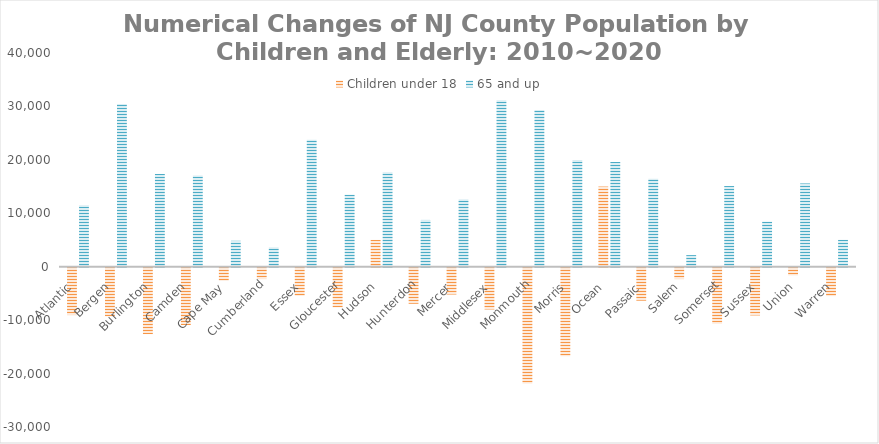
| Category | Children under 18 | 65 and up |
|---|---|---|
| Atlantic  | -8867 | 11502 |
| Bergen  | -9106 | 30448 |
| Burlington  | -12435 | 17340 |
| Camden  | -10718 | 17081 |
| Cape May  | -2441 | 4854 |
| Cumberland | -2123 | 3624 |
| Essex  | -5261 | 23770 |
| Gloucester | -7427 | 13478 |
| Hudson  | 5020 | 17689 |
| Hunterdon | -6750 | 8755 |
| Mercer  | -5016 | 12614 |
| Middlesex  | -7814 | 31136 |
| Monmouth | -21691 | 29354 |
| Morris  | -16584 | 19991 |
| Ocean  | 15005 | 19614 |
| Passaic  | -6173 | 16462 |
| Salem  | -2129 | 2171 |
| Somerset | -10480 | 15098 |
| Sussex  | -8932 | 8437 |
| Union  | -1438 | 15586 |
| Warren  | -5319 | 5031 |